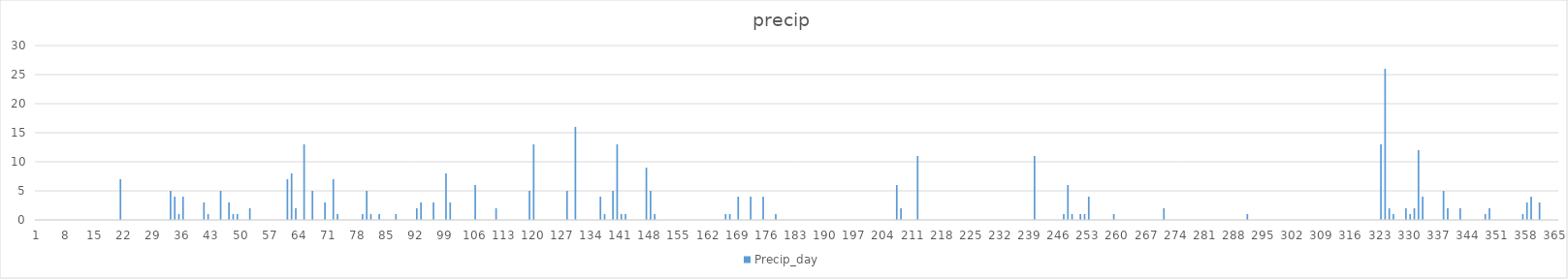
| Category | Precip_day |
|---|---|
| 0 | 0 |
| 1 | 0 |
| 2 | 0 |
| 3 | 0 |
| 4 | 0 |
| 5 | 0 |
| 6 | 0 |
| 7 | 0 |
| 8 | 0 |
| 9 | 0 |
| 10 | 0 |
| 11 | 0 |
| 12 | 0 |
| 13 | 0 |
| 14 | 0 |
| 15 | 0 |
| 16 | 0 |
| 17 | 0 |
| 18 | 0 |
| 19 | 0 |
| 20 | 7 |
| 21 | 0 |
| 22 | 0 |
| 23 | 0 |
| 24 | 0 |
| 25 | 0 |
| 26 | 0 |
| 27 | 0 |
| 28 | 0 |
| 29 | 0 |
| 30 | 0 |
| 31 | 0 |
| 32 | 5 |
| 33 | 4 |
| 34 | 1 |
| 35 | 4 |
| 36 | 0 |
| 37 | 0 |
| 38 | 0 |
| 39 | 0 |
| 40 | 3 |
| 41 | 1 |
| 42 | 0 |
| 43 | 0 |
| 44 | 5 |
| 45 | 0 |
| 46 | 3 |
| 47 | 1 |
| 48 | 1 |
| 49 | 0 |
| 50 | 0 |
| 51 | 2 |
| 52 | 0 |
| 53 | 0 |
| 54 | 0 |
| 55 | 0 |
| 56 | 0 |
| 57 | 0 |
| 58 | 0 |
| 59 | 0 |
| 60 | 7 |
| 61 | 8 |
| 62 | 2 |
| 63 | 0 |
| 64 | 13 |
| 65 | 0 |
| 66 | 5 |
| 67 | 0 |
| 68 | 0 |
| 69 | 3 |
| 70 | 0 |
| 71 | 7 |
| 72 | 1 |
| 73 | 0 |
| 74 | 0 |
| 75 | 0 |
| 76 | 0 |
| 77 | 0 |
| 78 | 1 |
| 79 | 5 |
| 80 | 1 |
| 81 | 0 |
| 82 | 1 |
| 83 | 0 |
| 84 | 0 |
| 85 | 0 |
| 86 | 1 |
| 87 | 0 |
| 88 | 0 |
| 89 | 0 |
| 90 | 0 |
| 91 | 2 |
| 92 | 3 |
| 93 | 0 |
| 94 | 0 |
| 95 | 3 |
| 96 | 0 |
| 97 | 0 |
| 98 | 8 |
| 99 | 3 |
| 100 | 0 |
| 101 | 0 |
| 102 | 0 |
| 103 | 0 |
| 104 | 0 |
| 105 | 6 |
| 106 | 0 |
| 107 | 0 |
| 108 | 0 |
| 109 | 0 |
| 110 | 2 |
| 111 | 0 |
| 112 | 0 |
| 113 | 0 |
| 114 | 0 |
| 115 | 0 |
| 116 | 0 |
| 117 | 0 |
| 118 | 5 |
| 119 | 13 |
| 120 | 0 |
| 121 | 0 |
| 122 | 0 |
| 123 | 0 |
| 124 | 0 |
| 125 | 0 |
| 126 | 0 |
| 127 | 5 |
| 128 | 0 |
| 129 | 16 |
| 130 | 0 |
| 131 | 0 |
| 132 | 0 |
| 133 | 0 |
| 134 | 0 |
| 135 | 4 |
| 136 | 1 |
| 137 | 0 |
| 138 | 5 |
| 139 | 13 |
| 140 | 1 |
| 141 | 1 |
| 142 | 0 |
| 143 | 0 |
| 144 | 0 |
| 145 | 0 |
| 146 | 9 |
| 147 | 5 |
| 148 | 1 |
| 149 | 0 |
| 150 | 0 |
| 151 | 0 |
| 152 | 0 |
| 153 | 0 |
| 154 | 0 |
| 155 | 0 |
| 156 | 0 |
| 157 | 0 |
| 158 | 0 |
| 159 | 0 |
| 160 | 0 |
| 161 | 0 |
| 162 | 0 |
| 163 | 0 |
| 164 | 0 |
| 165 | 1 |
| 166 | 1 |
| 167 | 0 |
| 168 | 4 |
| 169 | 0 |
| 170 | 0 |
| 171 | 4 |
| 172 | 0 |
| 173 | 0 |
| 174 | 4 |
| 175 | 0 |
| 176 | 0 |
| 177 | 1 |
| 178 | 0 |
| 179 | 0 |
| 180 | 0 |
| 181 | 0 |
| 182 | 0 |
| 183 | 0 |
| 184 | 0 |
| 185 | 0 |
| 186 | 0 |
| 187 | 0 |
| 188 | 0 |
| 189 | 0 |
| 190 | 0 |
| 191 | 0 |
| 192 | 0 |
| 193 | 0 |
| 194 | 0 |
| 195 | 0 |
| 196 | 0 |
| 197 | 0 |
| 198 | 0 |
| 199 | 0 |
| 200 | 0 |
| 201 | 0 |
| 202 | 0 |
| 203 | 0 |
| 204 | 0 |
| 205 | 0 |
| 206 | 6 |
| 207 | 2 |
| 208 | 0 |
| 209 | 0 |
| 210 | 0 |
| 211 | 11 |
| 212 | 0 |
| 213 | 0 |
| 214 | 0 |
| 215 | 0 |
| 216 | 0 |
| 217 | 0 |
| 218 | 0 |
| 219 | 0 |
| 220 | 0 |
| 221 | 0 |
| 222 | 0 |
| 223 | 0 |
| 224 | 0 |
| 225 | 0 |
| 226 | 0 |
| 227 | 0 |
| 228 | 0 |
| 229 | 0 |
| 230 | 0 |
| 231 | 0 |
| 232 | 0 |
| 233 | 0 |
| 234 | 0 |
| 235 | 0 |
| 236 | 0 |
| 237 | 0 |
| 238 | 0 |
| 239 | 11 |
| 240 | 0 |
| 241 | 0 |
| 242 | 0 |
| 243 | 0 |
| 244 | 0 |
| 245 | 0 |
| 246 | 1 |
| 247 | 6 |
| 248 | 1 |
| 249 | 0 |
| 250 | 1 |
| 251 | 1 |
| 252 | 4 |
| 253 | 0 |
| 254 | 0 |
| 255 | 0 |
| 256 | 0 |
| 257 | 0 |
| 258 | 1 |
| 259 | 0 |
| 260 | 0 |
| 261 | 0 |
| 262 | 0 |
| 263 | 0 |
| 264 | 0 |
| 265 | 0 |
| 266 | 0 |
| 267 | 0 |
| 268 | 0 |
| 269 | 0 |
| 270 | 2 |
| 271 | 0 |
| 272 | 0 |
| 273 | 0 |
| 274 | 0 |
| 275 | 0 |
| 276 | 0 |
| 277 | 0 |
| 278 | 0 |
| 279 | 0 |
| 280 | 0 |
| 281 | 0 |
| 282 | 0 |
| 283 | 0 |
| 284 | 0 |
| 285 | 0 |
| 286 | 0 |
| 287 | 0 |
| 288 | 0 |
| 289 | 0 |
| 290 | 1 |
| 291 | 0 |
| 292 | 0 |
| 293 | 0 |
| 294 | 0 |
| 295 | 0 |
| 296 | 0 |
| 297 | 0 |
| 298 | 0 |
| 299 | 0 |
| 300 | 0 |
| 301 | 0 |
| 302 | 0 |
| 303 | 0 |
| 304 | 0 |
| 305 | 0 |
| 306 | 0 |
| 307 | 0 |
| 308 | 0 |
| 309 | 0 |
| 310 | 0 |
| 311 | 0 |
| 312 | 0 |
| 313 | 0 |
| 314 | 0 |
| 315 | 0 |
| 316 | 0 |
| 317 | 0 |
| 318 | 0 |
| 319 | 0 |
| 320 | 0 |
| 321 | 0 |
| 322 | 13 |
| 323 | 26 |
| 324 | 2 |
| 325 | 1 |
| 326 | 0 |
| 327 | 0 |
| 328 | 2 |
| 329 | 1 |
| 330 | 2 |
| 331 | 12 |
| 332 | 4 |
| 333 | 0 |
| 334 | 0 |
| 335 | 0 |
| 336 | 0 |
| 337 | 5 |
| 338 | 2 |
| 339 | 0 |
| 340 | 0 |
| 341 | 2 |
| 342 | 0 |
| 343 | 0 |
| 344 | 0 |
| 345 | 0 |
| 346 | 0 |
| 347 | 1 |
| 348 | 2 |
| 349 | 0 |
| 350 | 0 |
| 351 | 0 |
| 352 | 0 |
| 353 | 0 |
| 354 | 0 |
| 355 | 0 |
| 356 | 1 |
| 357 | 3 |
| 358 | 4 |
| 359 | 0 |
| 360 | 3 |
| 361 | 0 |
| 362 | 0 |
| 363 | 0 |
| 364 | 0 |